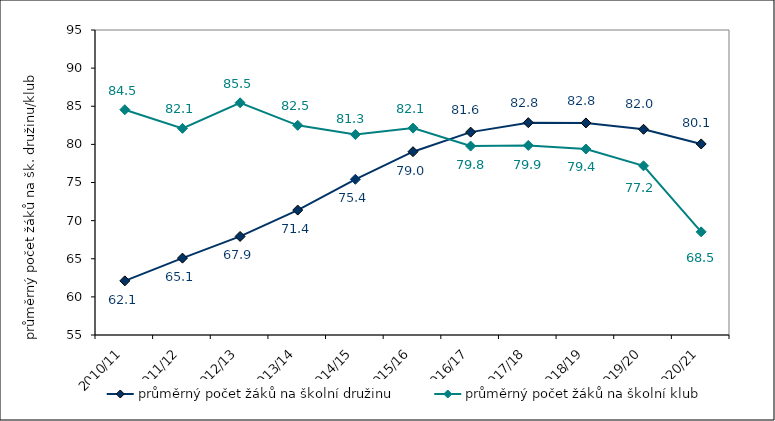
| Category | průměrný počet žáků na školní družinu | průměrný počet žáků na školní klub |
|---|---|---|
| 2010/11 | 62.099 | 84.546 |
| 2011/12 | 65.081 | 82.101 |
| 2012/13 | 67.925 | 85.456 |
| 2013/14 | 71.383 | 82.494 |
| 2014/15 | 75.422 | 81.292 |
| 2015/16 | 79.04 | 82.133 |
| 2016/17 | 81.605 | 79.778 |
| 2017/18 | 82.848 | 79.858 |
| 2018/19 | 82.813 | 79.391 |
| 2019/20 | 81.978 | 77.187 |
| 2020/21 | 80.056 | 68.525 |